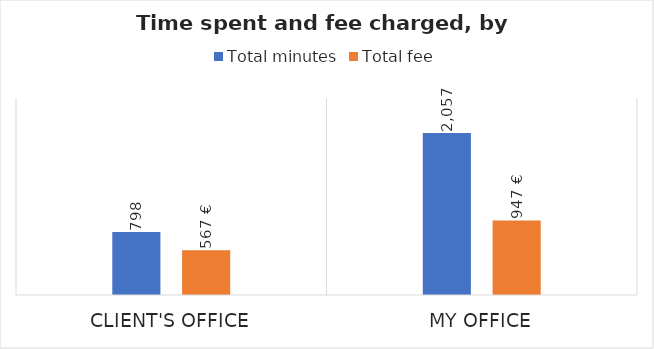
| Category | Total minutes | Total fee |
|---|---|---|
| Client's office | 798 | 567 |
| My office | 2057 | 947 |